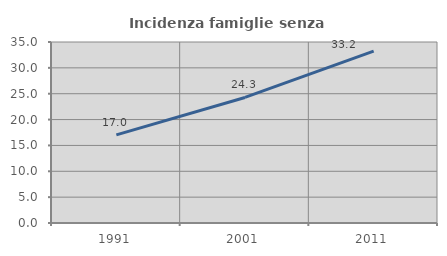
| Category | Incidenza famiglie senza nuclei |
|---|---|
| 1991.0 | 17.047 |
| 2001.0 | 24.276 |
| 2011.0 | 33.229 |